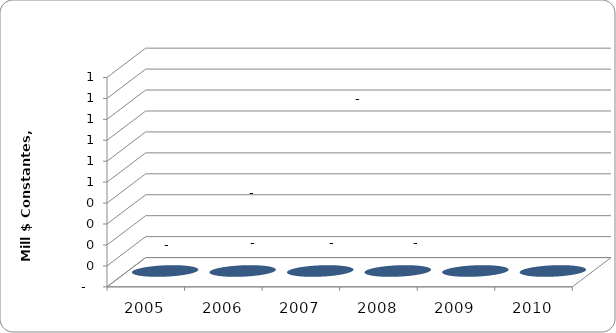
| Category | Series 0 |
|---|---|
| 2005 | 0 |
| 2006 | 0 |
| 2007 | 0 |
| 2008 | 0 |
| 2009 | 0 |
| 2010 | 0 |